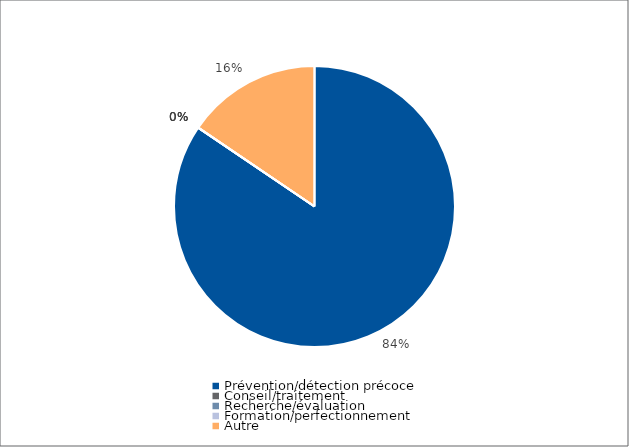
| Category | Series 0 |
|---|---|
| Prévention/détection précoce | 253565 |
| Conseil/traitement | 0 |
| Recherche/évaluation | 0 |
| Formation/perfectionnement | 0 |
| Autre | 46604 |